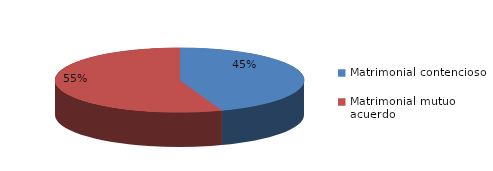
| Category | Series 0 |
|---|---|
| 0 | 243 |
| 1 | 303 |